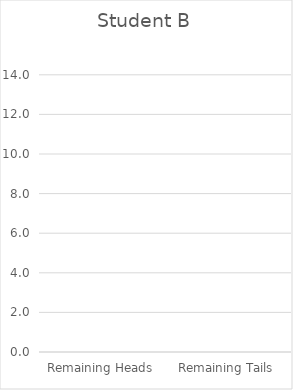
| Category | Series 0 |
|---|---|
| Remaining Heads | 0 |
| Remaining Tails | 0 |